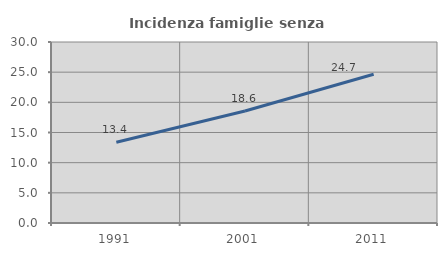
| Category | Incidenza famiglie senza nuclei |
|---|---|
| 1991.0 | 13.382 |
| 2001.0 | 18.567 |
| 2011.0 | 24.665 |